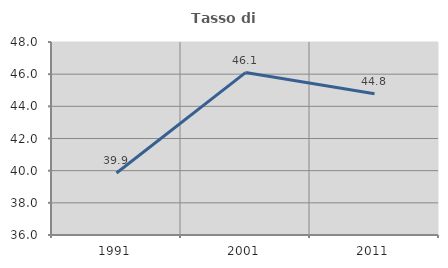
| Category | Tasso di occupazione   |
|---|---|
| 1991.0 | 39.856 |
| 2001.0 | 46.099 |
| 2011.0 | 44.786 |